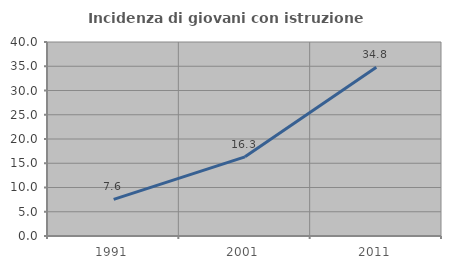
| Category | Incidenza di giovani con istruzione universitaria |
|---|---|
| 1991.0 | 7.563 |
| 2001.0 | 16.317 |
| 2011.0 | 34.787 |